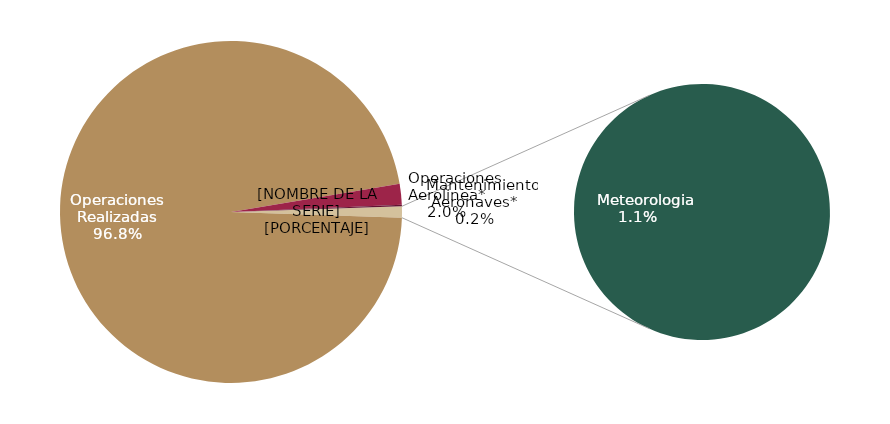
| Category | Cancelaciones |
|---|---|
| Operaciones Realizadas | 640 |
|    Operaciones Aerolinea* | 13 |
|    Mantenimiento Aeronaves* | 1 |
|    Otras Imputables | 0 |
|    Meteorologia | 7 |
|    Otras No Imputables | 0 |